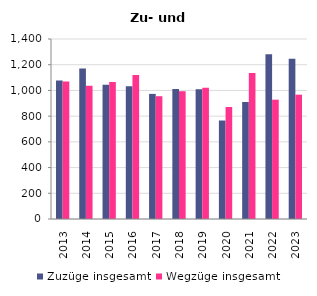
| Category | Zuzüge insgesamt | Wegzüge insgesamt |
|---|---|---|
| 2013.0 | 1078 | 1069 |
| 2014.0 | 1171 | 1036 |
| 2015.0 | 1045 | 1066 |
| 2016.0 | 1033 | 1120 |
| 2017.0 | 973 | 955 |
| 2018.0 | 1012 | 994 |
| 2019.0 | 1009 | 1021 |
| 2020.0 | 766 | 871 |
| 2021.0 | 910 | 1135 |
| 2022.0 | 1282 | 928 |
| 2023.0 | 1246 | 967 |